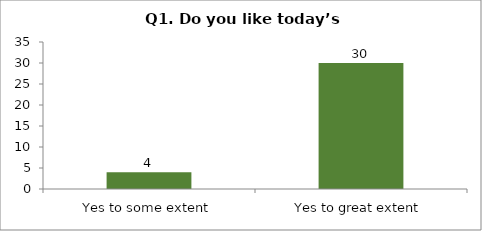
| Category | Q1. Do you like today’s session? |
|---|---|
| Yes to some extent | 4 |
| Yes to great extent | 30 |